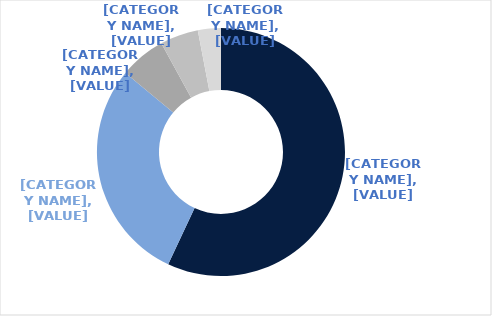
| Category | Series 0 |
|---|---|
| Sydney | 0.57 |
| Melbourne | 0.29 |
| Perth | 0.06 |
| Brisbane | 0.05 |
| Canberra | 0.03 |